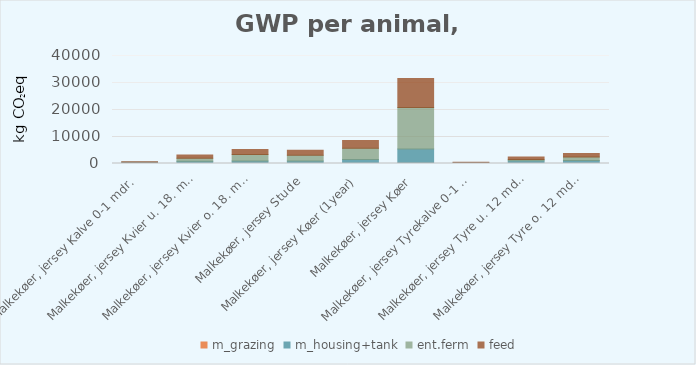
| Category | m_grazing | m_housing+tank | ent.ferm | feed |
|---|---|---|---|---|
| Malkekøer, jersey Kalve 0-1 mdr. | 0 | 430.104 | 0 | 225.679 |
| Malkekøer, jersey Kvier u. 18. mdr. | 27.178 | 838.994 | 1093.266 | 1175.41 |
| Malkekøer, jersey Kvier o. 18. mdr. | 34.042 | 868.406 | 2393.809 | 1925.417 |
| Malkekøer, jersey Stude | 32.878 | 866.077 | 2192.195 | 1830.328 |
| Malkekøer, jersey Køer (1year) | 31.271 | 1409.085 | 4235.366 | 2857.08 |
| Malkekøer, jersey Køer | 130.201 | 5201.342 | 15417.561 | 10710.938 |
| Malkekøer, jersey Tyrekalve 0-1 mdr. | 0 | 271.681 | 0 | 225.679 |
| Malkekøer, jersey Tyre u. 12 mdr. | 0 | 1001.951 | 517.275 | 850.124 |
| Malkekøer, jersey Tyre o. 12 mdr. | 0 | 1082.717 | 1362.047 | 1240.009 |